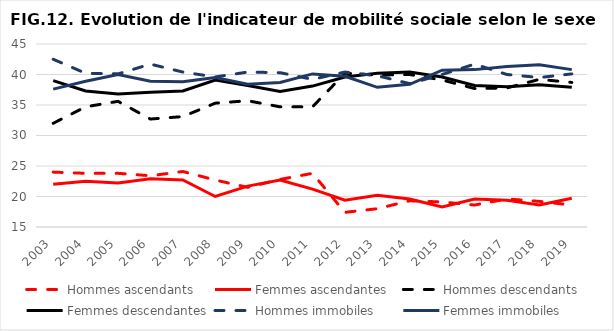
| Category | Hommes ascendants | Femmes ascendantes | Hommes descendants | Femmes descendantes | Hommes immobiles | Femmes immobiles |
|---|---|---|---|---|---|---|
| 2003.0 | 24 | 22 | 32 | 39 | 42.5 | 37.6 |
| 2004.0 | 23.8 | 22.5 | 34.7 | 37.3 | 40.2 | 38.9 |
| 2005.0 | 23.8 | 22.2 | 35.6 | 36.8 | 40.1 | 40 |
| 2006.0 | 23.4 | 22.9 | 32.7 | 37.1 | 41.7 | 38.9 |
| 2007.0 | 24.1 | 22.7 | 33.1 | 37.3 | 40.4 | 38.8 |
| 2008.0 | 22.7 | 20 | 35.3 | 39.1 | 39.6 | 39.5 |
| 2009.0 | 21.5 | 21.7 | 35.7 | 38.2 | 40.4 | 38.4 |
| 2010.0 | 22.8 | 22.7 | 34.7 | 37.2 | 40.3 | 38.7 |
| 2011.0 | 23.8 | 21.2 | 34.7 | 38.1 | 39.2 | 40.1 |
| 2012.0 | 17.4 | 19.4 | 40.2 | 39.6 | 40.4 | 39.7 |
| 2013.0 | 18 | 20.2 | 39.9 | 40.2 | 39.8 | 37.9 |
| 2014.0 | 19.3 | 19.6 | 40 | 40.4 | 38.5 | 38.4 |
| 2015.0 | 19.1 | 18.3 | 39.1 | 39.6 | 40 | 40.7 |
| 2016.0 | 18.6 | 19.6 | 37.7 | 38.2 | 41.7 | 40.8 |
| 2017.0 | 19.6 | 19.4 | 37.8 | 38 | 40 | 41.3 |
| 2018.0 | 19.2 | 18.6 | 39.2 | 38.3 | 39.5 | 41.6 |
| 2019.0 | 18.6 | 19.7 | 38.7 | 37.9 | 40.1 | 40.8 |